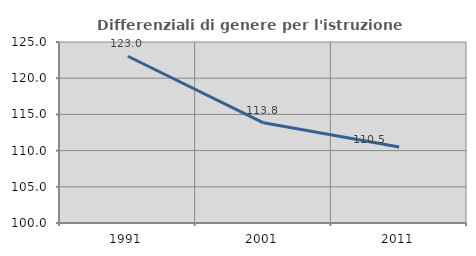
| Category | Differenziali di genere per l'istruzione superiore |
|---|---|
| 1991.0 | 123.029 |
| 2001.0 | 113.842 |
| 2011.0 | 110.506 |